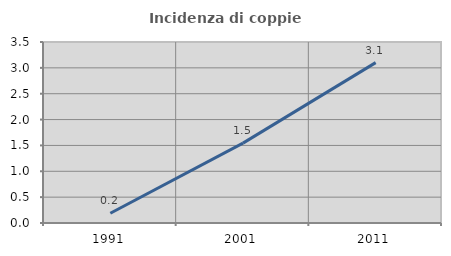
| Category | Incidenza di coppie miste |
|---|---|
| 1991.0 | 0.189 |
| 2001.0 | 1.544 |
| 2011.0 | 3.102 |